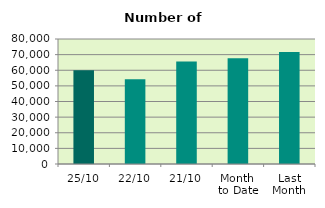
| Category | Series 0 |
|---|---|
| 25/10 | 59976 |
| 22/10 | 54196 |
| 21/10 | 65572 |
| Month 
to Date | 67639.765 |
| Last
Month | 71692 |